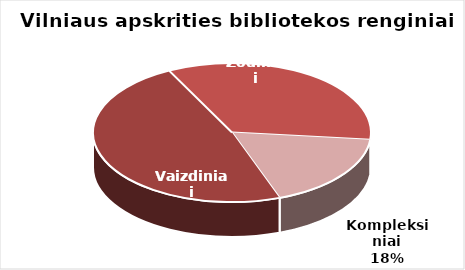
| Category | Series 0 |
|---|---|
| Vaizdiniai | 3465 |
| Žodiniai | 2459 |
| Kompleksiniai | 1284 |